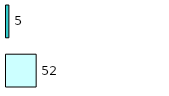
| Category | Series 0 | Series 1 |
|---|---|---|
| 0 | 52 | 5 |